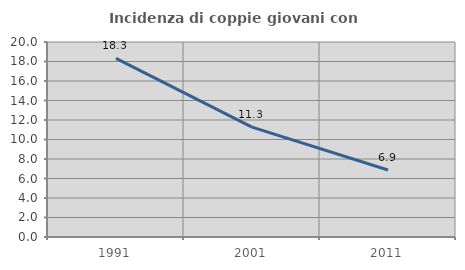
| Category | Incidenza di coppie giovani con figli |
|---|---|
| 1991.0 | 18.312 |
| 2001.0 | 11.268 |
| 2011.0 | 6.874 |